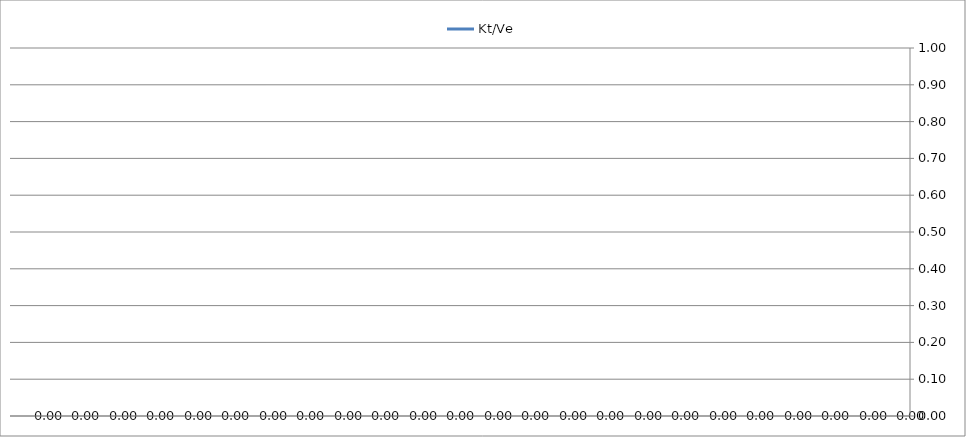
| Category | Kt/Ve |
|---|---|
|  | 0 |
|  | 0 |
|  | 0 |
|  | 0 |
|  | 0 |
|  | 0 |
|  | 0 |
|  | 0 |
|  | 0 |
|  | 0 |
|  | 0 |
|  | 0 |
|  | 0 |
|  | 0 |
|  | 0 |
|  | 0 |
|  | 0 |
|  | 0 |
|  | 0 |
|  | 0 |
|  | 0 |
|  | 0 |
|  | 0 |
|  | 0 |